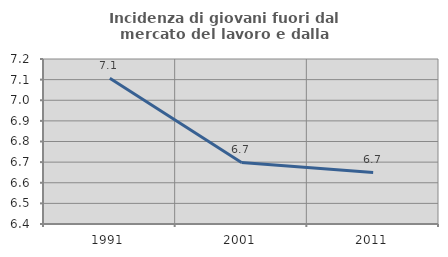
| Category | Incidenza di giovani fuori dal mercato del lavoro e dalla formazione  |
|---|---|
| 1991.0 | 7.107 |
| 2001.0 | 6.699 |
| 2011.0 | 6.65 |